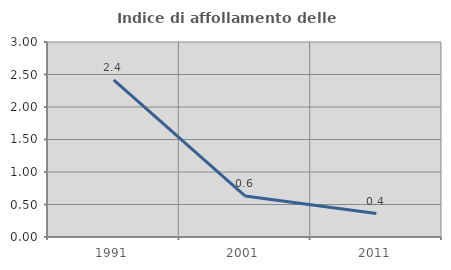
| Category | Indice di affollamento delle abitazioni  |
|---|---|
| 1991.0 | 2.417 |
| 2001.0 | 0.632 |
| 2011.0 | 0.361 |